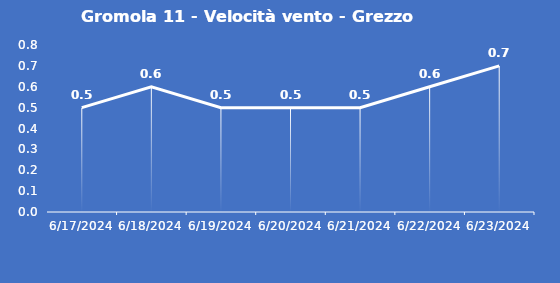
| Category | Gromola 11 - Velocità vento - Grezzo (m/s) |
|---|---|
| 6/17/24 | 0.5 |
| 6/18/24 | 0.6 |
| 6/19/24 | 0.5 |
| 6/20/24 | 0.5 |
| 6/21/24 | 0.5 |
| 6/22/24 | 0.6 |
| 6/23/24 | 0.7 |